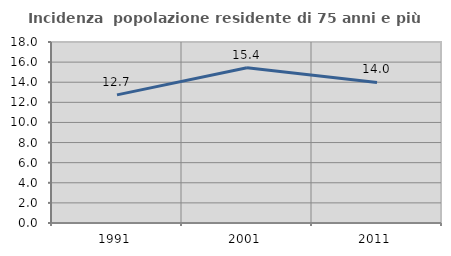
| Category | Incidenza  popolazione residente di 75 anni e più |
|---|---|
| 1991.0 | 12.741 |
| 2001.0 | 15.437 |
| 2011.0 | 13.982 |